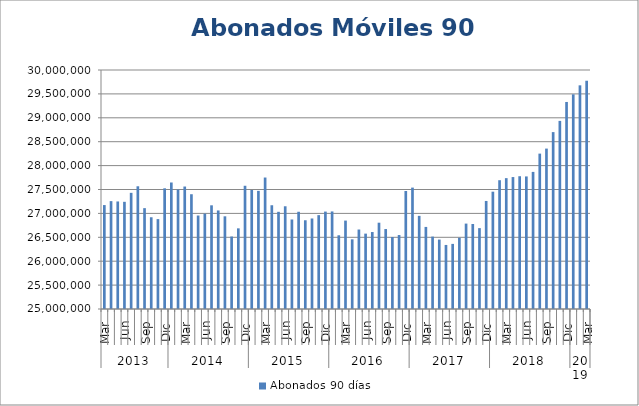
| Category | Abonados 90 días  |
|---|---|
| 0 | 27174429 |
| 1 | 27256799 |
| 2 | 27249896 |
| 3 | 27242396 |
| 4 | 27430194 |
| 5 | 27567464 |
| 6 | 27110010 |
| 7 | 26919316 |
| 8 | 26880609 |
| 9 | 27524963 |
| 10 | 27646717 |
| 11 | 27499992 |
| 12 | 27562088 |
| 13 | 27401040 |
| 14 | 26955717 |
| 15 | 26994609 |
| 16 | 27169188 |
| 17 | 27061687 |
| 18 | 26939071 |
| 19 | 26516500 |
| 20 | 26687326 |
| 21 | 27578143 |
| 22 | 27489223 |
| 23 | 27471553 |
| 24 | 27750473 |
| 25 | 27170692 |
| 26 | 27033211 |
| 27 | 27149172 |
| 28 | 26872979 |
| 29 | 27034173 |
| 30 | 26856662 |
| 31 | 26893632 |
| 32 | 26963755 |
| 33 | 27037951 |
| 34 | 27040824 |
| 35 | 26542149 |
| 36 | 26849710 |
| 37 | 26457447 |
| 38 | 26662676 |
| 39 | 26576782 |
| 40 | 26610099 |
| 41 | 26805521 |
| 42 | 26672717 |
| 43 | 26505805 |
| 44 | 26547173 |
| 45 | 27469211 |
| 46 | 27539556 |
| 47 | 26948853 |
| 48 | 26717067 |
| 49 | 26514588 |
| 50 | 26452370 |
| 51 | 26339907 |
| 52 | 26362130 |
| 53 | 26490787 |
| 54 | 26786764 |
| 55 | 26778405 |
| 56 | 26691976 |
| 57 | 27260107 |
| 58 | 27454349 |
| 59 | 27694179 |
| 60 | 27737550 |
| 61 | 27760296 |
| 62 | 27777818 |
| 63 | 27773600 |
| 64 | 27868225 |
| 65 | 28250702 |
| 66 | 28355724 |
| 67 | 28700770 |
| 68 | 28935345 |
| 69 | 29331337 |
| 70 | 29491024 |
| 71 | 29679237 |
| 72 | 29775295 |